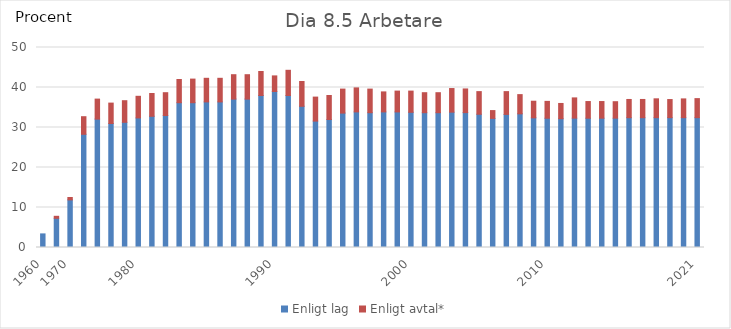
| Category | Enligt lag | Enligt avtal* |
|---|---|---|
| 1960 | 3.4 | 0 |
|  | 7.3 | 0.5 |
| 1970 | 11.9 | 0.6 |
|  | 28.3 | 4.4 |
|  | 32.1 | 5 |
|  | 31 | 5.1 |
|  | 31.3 | 5.4 |
| 1980 | 32.4 | 5.4 |
|  | 32.8 | 5.7 |
|  | 33 | 5.7 |
|  | 36.2 | 5.8 |
|  | 36.2 | 5.9 |
|  | 36.4 | 5.9 |
|  | 36.4 | 5.9 |
|  | 37.1 | 6.1 |
|  | 37.1 | 6.1 |
|  | 38 | 6 |
| 1990 | 39 | 3.9 |
|  | 38 | 6.3 |
|  | 35.3 | 6.2 |
|  | 31.6 | 6 |
|  | 32 | 6 |
|  | 33.6 | 6 |
|  | 33.9 | 6 |
|  | 33.7 | 5.9 |
|  | 33.9 | 5 |
|  | 33.9 | 5.2 |
| 2000 | 33.8 | 5.3 |
|  | 33.7 | 5 |
|  | 33.7 | 5 |
|  | 33.84 | 5.9 |
|  | 33.72 | 5.92 |
|  | 33.31 | 5.66 |
|  | 32.28 | 1.95 |
|  | 33.27 | 5.7 |
|  | 33.42 | 4.8 |
|  | 32.42 | 4.15 |
| 2010 | 32.32 | 4.21 |
|  | 32.2 | 3.81 |
|  | 32.34 | 5.06 |
|  | 32.33 | 4.16 |
|  | 32.33 | 4.16 |
|  | 32.34 | 4.11 |
|  | 32.45 | 4.56 |
|  | 32.45 | 4.56 |
|  | 32.46 | 4.71 |
|  | 32.46 | 4.53 |
|  | 32.46 | 4.69 |
| 2021 | 32.46 | 4.76 |